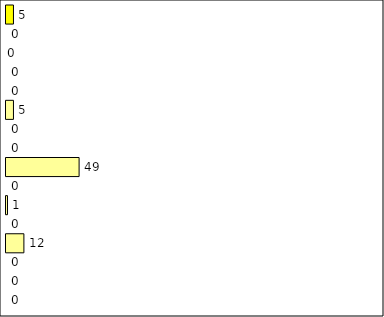
| Category | -2 | -1 | 0 | 1 | 2 | 3 | 4 | 5 | 6 | 7 | 8 | 9 | 10 | 11 | 12 | Perfect Round |
|---|---|---|---|---|---|---|---|---|---|---|---|---|---|---|---|---|
| 0 | 0 | 0 | 0 | 12 | 0 | 1 | 0 | 49 | 0 | 0 | 5 | 0 | 0 | 0 | 0 | 5 |